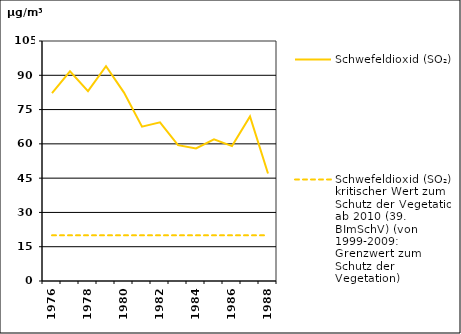
| Category | Schwefeldioxid (SO₂) | Schwefeldioxid (SO₂) kritischer Wert zum Schutz der Vegetation ab 2010 (39. BImSchV) (von 1999-2009: Grenzwert zum Schutz der Vegetation) |
|---|---|---|
| 1976.0 | 82.167 | 20 |
| 1977.0 | 91.75 | 20 |
| 1978.0 | 83.083 | 20 |
| 1979.0 | 94 | 20 |
| 1980.0 | 82.417 | 20 |
| 1981.0 | 67.5 | 20 |
| 1982.0 | 69.417 | 20 |
| 1983.0 | 59.417 | 20 |
| 1984.0 | 58 | 20 |
| 1985.0 | 62 | 20 |
| 1986.0 | 59 | 20 |
| 1987.0 | 72 | 20 |
| 1988.0 | 47 | 20 |